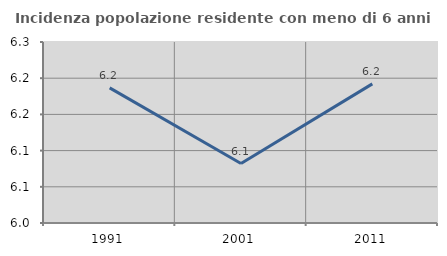
| Category | Incidenza popolazione residente con meno di 6 anni |
|---|---|
| 1991.0 | 6.187 |
| 2001.0 | 6.082 |
| 2011.0 | 6.192 |